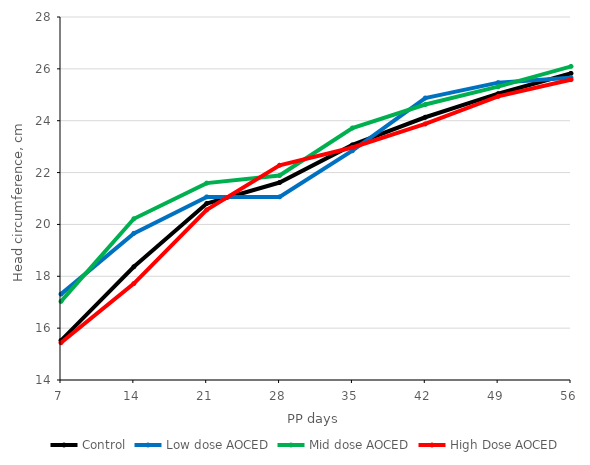
| Category | Series 0 | Control | Low dose AOCED | Mid dose AOCED | High Dose AOCED |
|---|---|---|---|---|---|
| 7.0 |  | 15.525 | 17.312 | 17.031 | 15.438 |
| 14.0 |  | 18.367 | 19.656 | 20.219 | 17.719 |
| 21.0 |  | 20.808 | 21.062 | 21.594 | 20.562 |
| 28.0 |  | 21.617 | 21.062 | 21.889 | 22.281 |
| 35.0 |  | 23.067 | 22.844 | 23.719 | 22.969 |
| 42.0 |  | 24.133 | 24.875 | 24.625 | 23.875 |
| 49.0 |  | 25.042 | 25.469 | 25.312 | 24.938 |
| 56.0 |  | 25.825 | 25.656 | 26.094 | 25.583 |